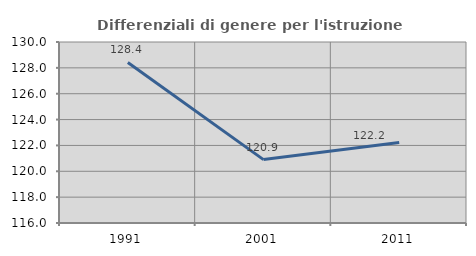
| Category | Differenziali di genere per l'istruzione superiore |
|---|---|
| 1991.0 | 128.416 |
| 2001.0 | 120.903 |
| 2011.0 | 122.234 |